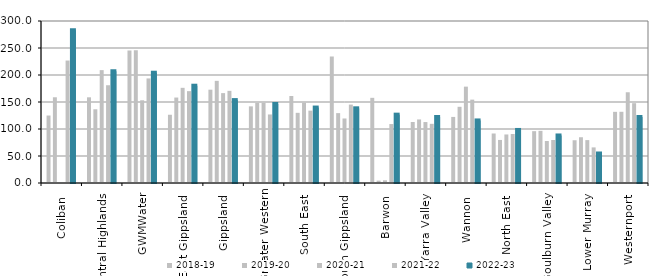
| Category | 2018-19 | 2019-20 | 2020-21 | 2021-22 | 2022-23 |
|---|---|---|---|---|---|
| Coliban  | 124.935 | 158.741 | 0 | 226.778 | 283 |
| Central Highlands  | 158.693 | 136.502 | 209.032 | 181.041 | 206.953 |
| GWMWater | 245.297 | 245.831 | 153.166 | 193.66 | 204.215 |
| East Gippsland  | 126.374 | 158.246 | 176.231 | 170.107 | 180.157 |
| Gippsland  | 172.801 | 189.169 | 166.448 | 170.659 | 153.523 |
| Greater Western | 141.899 | 148.409 | 148.58 | 126.913 | 146.255 |
| South East  | 161.137 | 129.935 | 148.86 | 133.983 | 139.729 |
| South Gippsland  | 234.275 | 129.384 | 119.479 | 145.223 | 138.315 |
| Barwon  | 157.723 | 4.398 | 5.042 | 109.159 | 126.57 |
| Yarra Valley  | 112.986 | 117.7 | 112.876 | 109.575 | 122.266 |
| Wannon  | 122.348 | 141.117 | 178.445 | 154.361 | 115.846 |
| North East  | 91.67 | 79.709 | 89.881 | 90.749 | 98.229 |
| Goulburn Valley  | 95.988 | 96.581 | 77.732 | 79.641 | 88.022 |
| Lower Murray  | 79.198 | 84.738 | 79.448 | 65.927 | 54.648 |
| Westernport  | 131.803 | 131.888 | 168.045 | 147.814 | 122.178 |